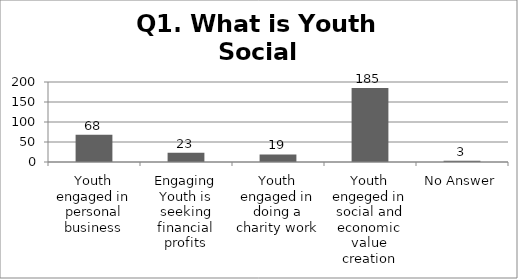
| Category | Q1. What is Youth Social Entrepreneurship? |
|---|---|
| Youth engaged in personal business | 68 |
| Engaging Youth is seeking financial profits | 23 |
| Youth engaged in doing a charity work | 19 |
| Youth engeged in social and economic value creation | 185 |
| No Answer | 3 |